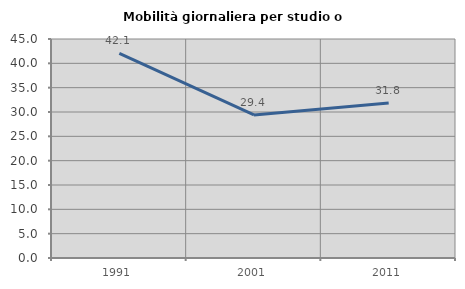
| Category | Mobilità giornaliera per studio o lavoro |
|---|---|
| 1991.0 | 42.058 |
| 2001.0 | 29.391 |
| 2011.0 | 31.841 |